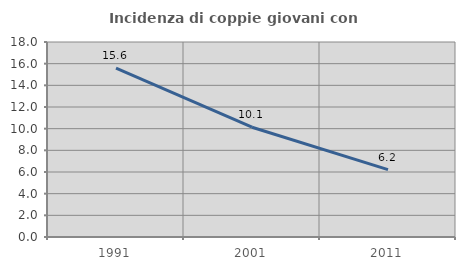
| Category | Incidenza di coppie giovani con figli |
|---|---|
| 1991.0 | 15.596 |
| 2001.0 | 10.135 |
| 2011.0 | 6.214 |